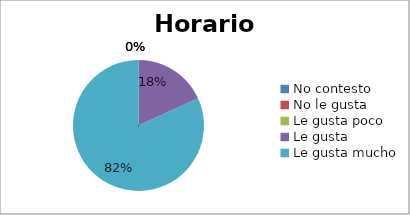
| Category | Series 0 |
|---|---|
| No contesto | 0 |
| No le gusta | 0 |
| Le gusta poco | 0 |
| Le gusta | 2 |
| Le gusta mucho | 9 |